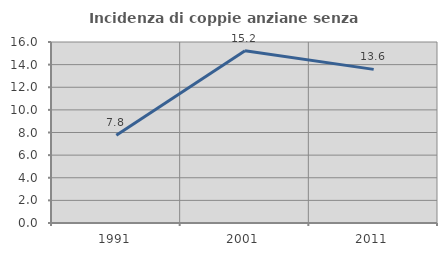
| Category | Incidenza di coppie anziane senza figli  |
|---|---|
| 1991.0 | 7.761 |
| 2001.0 | 15.217 |
| 2011.0 | 13.58 |